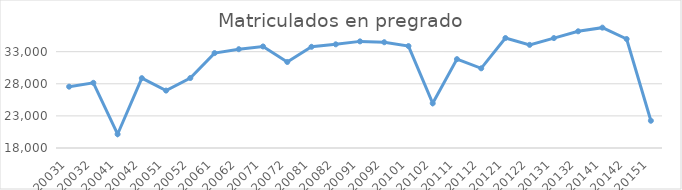
| Category | Matriculados  |
|---|---|
| 20031 | 27550 |
| 20032 | 28150 |
| 20041 | 20146 |
| 20042 | 28876 |
| 20051 | 26942 |
| 20052 | 28900 |
| 20061 | 32779 |
| 20062 | 33388 |
| 20071 | 33812 |
| 20072 | 31399 |
| 20081 | 33762 |
| 20082 | 34146 |
| 20091 | 34605 |
| 20092 | 34472 |
| 20101 | 33871 |
| 20102 | 24958 |
| 20111 | 31837 |
| 20112 | 30409 |
| 20121 | 35125 |
| 20122 | 34061 |
| 20131 | 35119 |
| 20132 | 36176 |
| 20141 | 36744 |
| 20142 | 34973 |
| 20151 | 22244 |